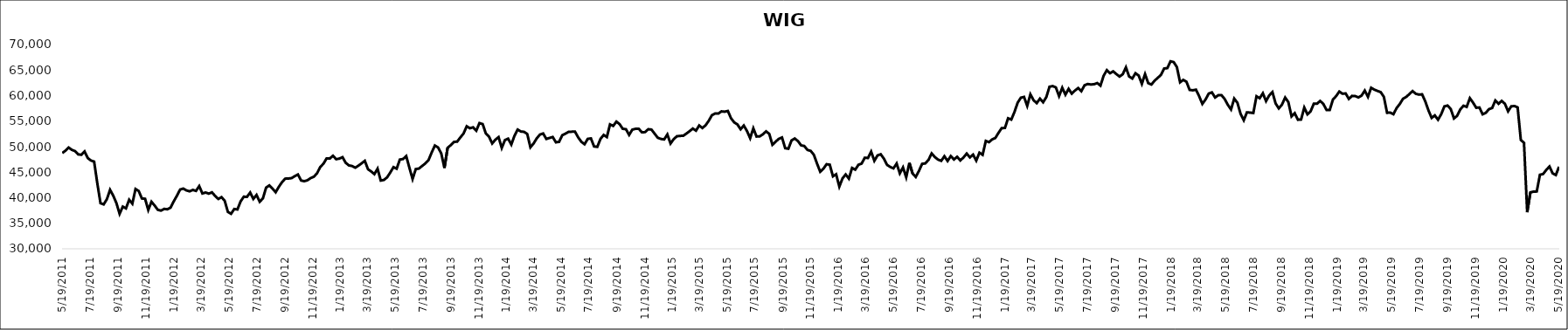
| Category | WIG |
|---|---|
| 5/19/11 | 48747.55 |
| 5/26/11 | 49215.53 |
| 6/2/11 | 49824.93 |
| 6/9/11 | 49378.82 |
| 6/16/11 | 49129.21 |
| 6/23/11 | 48485.26 |
| 6/30/11 | 48414.36 |
| 7/7/11 | 49057.05 |
| 7/14/11 | 47768.38 |
| 7/21/11 | 47291.31 |
| 7/28/11 | 47071.4 |
| 8/4/11 | 42828.22 |
| 8/11/11 | 38934.71 |
| 8/18/11 | 38697.56 |
| 8/25/11 | 39715.27 |
| 9/1/11 | 41553.09 |
| 9/8/11 | 40405.17 |
| 9/15/11 | 38945 |
| 9/22/11 | 36851.2 |
| 9/29/11 | 38264.32 |
| 10/6/11 | 37915.03 |
| 10/13/11 | 39608.13 |
| 10/20/11 | 38835.92 |
| 10/27/11 | 41708.88 |
| 11/3/11 | 41313.92 |
| 11/10/11 | 39853.18 |
| 11/17/11 | 39797.19 |
| 11/24/11 | 37607.27 |
| 12/1/11 | 39215.21 |
| 12/8/11 | 38474.28 |
| 12/15/11 | 37637.47 |
| 12/22/11 | 37478.7 |
| 12/29/11 | 37814.52 |
| 1/5/12 | 37739.39 |
| 1/12/12 | 38062.87 |
| 1/19/12 | 39288.13 |
| 1/26/12 | 40392.48 |
| 2/2/12 | 41602.24 |
| 2/9/12 | 41792.46 |
| 2/16/12 | 41430.3 |
| 2/23/12 | 41258.14 |
| 3/1/12 | 41533.87 |
| 3/8/12 | 41337.97 |
| 3/15/12 | 42281.33 |
| 3/22/12 | 40834.43 |
| 3/29/12 | 41028.06 |
| 4/5/12 | 40802.41 |
| 4/12/12 | 41053.82 |
| 4/19/12 | 40354.53 |
| 4/26/12 | 39761.78 |
| 5/3/12 | 40114.73 |
| 5/10/12 | 39404.16 |
| 5/17/12 | 37228.88 |
| 5/24/12 | 36852.75 |
| 5/31/12 | 37793.58 |
| 6/7/12 | 37707.25 |
| 6/14/12 | 39286.64 |
| 6/21/12 | 40207.61 |
| 6/28/12 | 40165.34 |
| 7/5/12 | 41013.96 |
| 7/12/12 | 39778.1 |
| 7/19/12 | 40545.64 |
| 7/26/12 | 39213.05 |
| 8/2/12 | 39876.95 |
| 8/9/12 | 41976.63 |
| 8/16/12 | 42408.41 |
| 8/23/12 | 41795.63 |
| 8/30/12 | 41077.44 |
| 9/6/12 | 42134.93 |
| 9/13/12 | 43047.41 |
| 9/20/12 | 43737.02 |
| 9/27/12 | 43763.3 |
| 10/4/12 | 43840.23 |
| 10/11/12 | 44224.67 |
| 10/18/12 | 44550.12 |
| 10/25/12 | 43374.6 |
| 11/1/12 | 43232.44 |
| 11/8/12 | 43429.42 |
| 11/15/12 | 43845.94 |
| 11/22/12 | 44121.53 |
| 11/29/12 | 44787.84 |
| 12/6/12 | 46019.97 |
| 12/13/12 | 46653.84 |
| 12/20/12 | 47701.82 |
| 12/27/12 | 47673.03 |
| 1/3/13 | 48222.72 |
| 1/10/13 | 47546.91 |
| 1/17/13 | 47661.37 |
| 1/24/13 | 47942.04 |
| 1/31/13 | 46840.15 |
| 2/7/13 | 46329.66 |
| 2/14/13 | 46211.54 |
| 2/21/13 | 45879.9 |
| 2/28/13 | 46280.36 |
| 3/7/13 | 46745.26 |
| 3/14/13 | 47223.68 |
| 3/21/13 | 45580.47 |
| 3/28/13 | 45147.57 |
| 4/4/13 | 44623.89 |
| 4/11/13 | 45688.48 |
| 4/18/13 | 43364.7 |
| 4/25/13 | 43482.18 |
| 5/2/13 | 43991.51 |
| 5/9/13 | 44943.16 |
| 5/16/13 | 45992.03 |
| 5/23/13 | 45687.76 |
| 5/30/13 | 47476.64 |
| 6/6/13 | 47573.66 |
| 6/13/13 | 48152.82 |
| 6/20/13 | 45870 |
| 6/27/13 | 43667.37 |
| 7/4/13 | 45613.75 |
| 7/11/13 | 45712.72 |
| 7/18/13 | 46221.23 |
| 7/25/13 | 46713.02 |
| 8/1/13 | 47370.81 |
| 8/8/13 | 48862.88 |
| 8/15/13 | 50223.95 |
| 8/22/13 | 49846.48 |
| 8/29/13 | 48676.45 |
| 9/5/13 | 45830.66 |
| 9/12/13 | 49771.55 |
| 9/19/13 | 50300.53 |
| 9/26/13 | 50936.34 |
| 10/3/13 | 50982.03 |
| 10/10/13 | 51806.83 |
| 10/17/13 | 52573.59 |
| 10/24/13 | 53994.46 |
| 10/31/13 | 53607.86 |
| 11/7/13 | 53785.07 |
| 11/14/13 | 53127.16 |
| 11/21/13 | 54621.21 |
| 11/28/13 | 54420.19 |
| 12/5/13 | 52597.13 |
| 12/12/13 | 51947.96 |
| 12/19/13 | 50631.75 |
| 12/26/13 | 51362.3 |
| 1/2/14 | 51865.89 |
| 1/9/14 | 49753.03 |
| 1/16/14 | 51288.7 |
| 1/23/14 | 51569.21 |
| 1/30/14 | 50417.17 |
| 2/6/14 | 52138.87 |
| 2/13/14 | 53349.65 |
| 2/20/14 | 52967.02 |
| 2/27/14 | 52906.04 |
| 3/6/14 | 52487.84 |
| 3/13/14 | 49878.65 |
| 3/20/14 | 50627.71 |
| 3/27/14 | 51642.99 |
| 4/3/14 | 52376.18 |
| 4/10/14 | 52580.73 |
| 4/17/14 | 51510.98 |
| 4/24/14 | 51705.76 |
| 5/1/14 | 51892.77 |
| 5/8/14 | 50851.25 |
| 5/15/14 | 50944.5 |
| 5/22/14 | 52244.13 |
| 5/29/14 | 52553.48 |
| 6/5/14 | 52901.29 |
| 6/12/14 | 52927.91 |
| 6/19/14 | 52937.45 |
| 6/26/14 | 51815.43 |
| 7/3/14 | 50951.73 |
| 7/10/14 | 50474.36 |
| 7/17/14 | 51527.37 |
| 7/24/14 | 51613.47 |
| 7/31/14 | 50037.12 |
| 8/7/14 | 49958.67 |
| 8/14/14 | 51512.57 |
| 8/21/14 | 52294.93 |
| 8/28/14 | 51882.01 |
| 9/4/14 | 54358.49 |
| 9/11/14 | 54065.27 |
| 9/18/14 | 54906.1 |
| 9/25/14 | 54411.77 |
| 10/2/14 | 53498.77 |
| 10/9/14 | 53416.03 |
| 10/16/14 | 52297.79 |
| 10/23/14 | 53335.43 |
| 10/30/14 | 53492 |
| 11/6/14 | 53512.14 |
| 11/13/14 | 52816.35 |
| 11/20/14 | 52848.54 |
| 11/27/14 | 53415.63 |
| 12/4/14 | 53346.86 |
| 12/11/14 | 52550.03 |
| 12/18/14 | 51739.04 |
| 12/25/14 | 51511.68 |
| 1/1/15 | 51416.08 |
| 1/8/15 | 52391 |
| 1/15/15 | 50616.63 |
| 1/22/15 | 51484.81 |
| 1/29/15 | 52040.24 |
| 2/5/15 | 52107.26 |
| 2/12/15 | 52139.81 |
| 2/19/15 | 52572.95 |
| 2/26/15 | 53042.6 |
| 3/5/15 | 53546.4 |
| 3/12/15 | 53136.13 |
| 3/19/15 | 54148.48 |
| 3/26/15 | 53649.9 |
| 4/2/15 | 54179.04 |
| 4/9/15 | 55063.85 |
| 4/16/15 | 56165.1 |
| 4/23/15 | 56492.95 |
| 4/30/15 | 56477.69 |
| 5/7/15 | 56911.34 |
| 5/14/15 | 56845.83 |
| 5/21/15 | 56990.6 |
| 5/28/15 | 55556.13 |
| 6/4/15 | 54749.74 |
| 6/11/15 | 54357.69 |
| 6/18/15 | 53408.53 |
| 6/25/15 | 54141.2 |
| 7/2/15 | 53074.71 |
| 7/9/15 | 51658.71 |
| 7/16/15 | 53588.24 |
| 7/23/15 | 51986.22 |
| 7/30/15 | 52011.81 |
| 8/6/15 | 52418.07 |
| 8/13/15 | 52995.96 |
| 8/20/15 | 52508.32 |
| 8/27/15 | 50366.09 |
| 9/3/15 | 50977.06 |
| 9/10/15 | 51527.08 |
| 9/17/15 | 51801.58 |
| 9/24/15 | 49701.31 |
| 10/1/15 | 49593.95 |
| 10/8/15 | 51222.77 |
| 10/15/15 | 51599.62 |
| 10/22/15 | 51094.29 |
| 10/29/15 | 50262.68 |
| 11/5/15 | 50125.85 |
| 11/12/15 | 49358.2 |
| 11/19/15 | 49177.74 |
| 11/26/15 | 48418.14 |
| 12/3/15 | 46693.09 |
| 12/10/15 | 45093.65 |
| 12/17/15 | 45684.05 |
| 12/24/15 | 46564.08 |
| 12/31/15 | 46467.38 |
| 1/7/16 | 44195.91 |
| 1/14/16 | 44596.08 |
| 1/21/16 | 42180.3 |
| 1/28/16 | 43778.96 |
| 2/4/16 | 44557.64 |
| 2/11/16 | 43741.96 |
| 2/18/16 | 45834.88 |
| 2/25/16 | 45497.77 |
| 3/3/16 | 46448.27 |
| 3/10/16 | 46686.74 |
| 3/17/16 | 47833.39 |
| 3/24/16 | 47778.01 |
| 3/31/16 | 49017.35 |
| 4/7/16 | 47231.36 |
| 4/14/16 | 48285.21 |
| 4/21/16 | 48514.39 |
| 4/28/16 | 47643.7 |
| 5/5/16 | 46430.16 |
| 5/12/16 | 46022.02 |
| 5/19/16 | 45751.68 |
| 5/26/16 | 46695.37 |
| 6/2/16 | 44772.72 |
| 6/9/16 | 45940.12 |
| 6/16/16 | 44007.81 |
| 6/23/16 | 46826.85 |
| 6/30/16 | 44748.53 |
| 7/7/16 | 44077.16 |
| 7/14/16 | 45246.26 |
| 7/21/16 | 46639.17 |
| 7/28/16 | 46718.98 |
| 8/4/16 | 47407.09 |
| 8/11/16 | 48675.96 |
| 8/18/16 | 47967.07 |
| 8/25/16 | 47464.07 |
| 9/1/16 | 47221.32 |
| 9/8/16 | 48129.15 |
| 9/15/16 | 47198.39 |
| 9/22/16 | 48154.88 |
| 9/29/16 | 47494.62 |
| 10/6/16 | 48014.44 |
| 10/13/16 | 47303.15 |
| 10/20/16 | 47894.17 |
| 10/27/16 | 48651.28 |
| 11/3/16 | 47899.61 |
| 11/10/16 | 48447.59 |
| 11/17/16 | 47274.21 |
| 11/24/16 | 48824.83 |
| 12/1/16 | 48404.21 |
| 12/8/16 | 51123.43 |
| 12/15/16 | 50881.35 |
| 12/22/16 | 51423.71 |
| 12/29/16 | 51703.91 |
| 1/5/17 | 52721.67 |
| 1/12/17 | 53650.94 |
| 1/19/17 | 53654.99 |
| 1/26/17 | 55560.23 |
| 2/2/17 | 55303.11 |
| 2/9/17 | 56785.52 |
| 2/16/17 | 58610.28 |
| 2/23/17 | 59583.89 |
| 3/2/17 | 59743.64 |
| 3/9/17 | 57986.6 |
| 3/16/17 | 60247.18 |
| 3/23/17 | 59093.68 |
| 3/30/17 | 58527.2 |
| 4/6/17 | 59406.36 |
| 4/13/17 | 58695.36 |
| 4/20/17 | 59700.07 |
| 4/27/17 | 61731.8 |
| 5/4/17 | 61862.8 |
| 5/11/17 | 61598.78 |
| 5/18/17 | 59901.12 |
| 5/25/17 | 61536.22 |
| 6/1/17 | 60181.96 |
| 6/8/17 | 61312.68 |
| 6/15/17 | 60381.07 |
| 6/22/17 | 60987.33 |
| 6/29/17 | 61475.96 |
| 7/6/17 | 60869.83 |
| 7/13/17 | 62018.68 |
| 7/20/17 | 62269.72 |
| 7/27/17 | 62171.7 |
| 8/3/17 | 62231.08 |
| 8/10/17 | 62451.57 |
| 8/17/17 | 61949.4 |
| 8/24/17 | 63886.54 |
| 8/31/17 | 64973.76 |
| 9/7/17 | 64381.87 |
| 9/14/17 | 64748.47 |
| 9/21/17 | 64209.19 |
| 9/28/17 | 63729.77 |
| 10/5/17 | 64185.71 |
| 10/12/17 | 65529.1 |
| 10/19/17 | 63745 |
| 10/26/17 | 63342.71 |
| 11/2/17 | 64375.83 |
| 11/9/17 | 63923.62 |
| 11/16/17 | 62299.29 |
| 11/23/17 | 64207.77 |
| 11/30/17 | 62440.31 |
| 12/7/17 | 62164.65 |
| 12/14/17 | 62916.39 |
| 12/21/17 | 63477.25 |
| 12/28/17 | 64053.47 |
| 1/4/18 | 65297.96 |
| 1/11/18 | 65379.88 |
| 1/18/18 | 66709.12 |
| 1/25/18 | 66561.79 |
| 2/1/18 | 65585.79 |
| 2/8/18 | 62604.89 |
| 2/15/18 | 63078.16 |
| 2/22/18 | 62717.27 |
| 3/1/18 | 61116.96 |
| 3/8/18 | 61036.99 |
| 3/15/18 | 61156.91 |
| 3/22/18 | 59862.55 |
| 3/29/18 | 58377.42 |
| 4/5/18 | 59244.04 |
| 4/12/18 | 60393.23 |
| 4/19/18 | 60629.81 |
| 4/26/18 | 59628.04 |
| 5/3/18 | 60066.46 |
| 5/10/18 | 60091.26 |
| 5/17/18 | 59337.27 |
| 5/24/18 | 58189.49 |
| 5/31/18 | 57282.73 |
| 6/7/18 | 59412.76 |
| 6/14/18 | 58603.93 |
| 6/21/18 | 56425.25 |
| 6/28/18 | 55169.77 |
| 7/5/18 | 56719.88 |
| 7/12/18 | 56671.44 |
| 7/19/18 | 56585.5 |
| 7/26/18 | 59871.2 |
| 8/2/18 | 59484.35 |
| 8/9/18 | 60455.75 |
| 8/16/18 | 58921.44 |
| 8/23/18 | 60044.45 |
| 8/30/18 | 60690.32 |
| 9/6/18 | 58469.6 |
| 9/13/18 | 57493.38 |
| 9/20/18 | 58231.57 |
| 9/27/18 | 59616.27 |
| 10/4/18 | 58736.08 |
| 10/11/18 | 55941.06 |
| 10/18/18 | 56560.93 |
| 10/25/18 | 55271.63 |
| 11/1/18 | 55312.71 |
| 11/8/18 | 57655.73 |
| 11/15/18 | 56329.01 |
| 11/22/18 | 56932.62 |
| 11/29/18 | 58412.94 |
| 12/6/18 | 58409.09 |
| 12/13/18 | 58952.55 |
| 12/20/18 | 58349.03 |
| 12/27/18 | 57183.28 |
| 1/3/19 | 57192.42 |
| 1/10/19 | 59219.23 |
| 1/17/19 | 59894.9 |
| 1/24/19 | 60791.02 |
| 1/31/19 | 60367.42 |
| 2/7/19 | 60422.38 |
| 2/14/19 | 59348.4 |
| 2/21/19 | 59938.07 |
| 2/28/19 | 59903.7 |
| 3/7/19 | 59638.3 |
| 3/14/19 | 60002.72 |
| 3/21/19 | 60976.51 |
| 3/28/19 | 59752.66 |
| 4/4/19 | 61533.27 |
| 4/11/19 | 61168.92 |
| 4/18/19 | 60910.11 |
| 4/25/19 | 60680.62 |
| 5/2/19 | 59744.3 |
| 5/9/19 | 56637.25 |
| 5/16/19 | 56664.5 |
| 5/23/19 | 56351.13 |
| 5/30/19 | 57566.83 |
| 6/6/19 | 58360.5 |
| 6/13/19 | 59374.38 |
| 6/20/19 | 59738.56 |
| 6/27/19 | 60293.37 |
| 7/4/19 | 60888.98 |
| 7/11/19 | 60362.11 |
| 7/18/19 | 60192.6 |
| 7/25/19 | 60249.72 |
| 8/1/19 | 58863.73 |
| 8/8/19 | 57102.69 |
| 8/15/19 | 55634.7 |
| 8/22/19 | 56118.92 |
| 8/29/19 | 55273.05 |
| 9/5/19 | 56358.3 |
| 9/12/19 | 57886.6 |
| 9/19/19 | 58053.03 |
| 9/26/19 | 57377.87 |
| 10/3/19 | 55523.06 |
| 10/10/19 | 56034.97 |
| 10/17/19 | 57297.12 |
| 10/24/19 | 58012.97 |
| 10/31/19 | 57783.02 |
| 11/7/19 | 59492.22 |
| 11/14/19 | 58622.1 |
| 11/21/19 | 57618.54 |
| 11/28/19 | 57669.94 |
| 12/5/19 | 56338.75 |
| 12/12/19 | 56621.06 |
| 12/19/19 | 57346.95 |
| 12/26/19 | 57569.71 |
| 1/2/20 | 59048.28 |
| 1/9/20 | 58397.17 |
| 1/16/20 | 58962.37 |
| 1/23/20 | 58401.85 |
| 1/30/20 | 56923.36 |
| 2/6/20 | 57900.04 |
| 2/13/20 | 57960.23 |
| 2/20/20 | 57693.12 |
| 2/27/20 | 51318.69 |
| 3/5/20 | 50753.91 |
| 3/12/20 | 37164.02 |
| 3/19/20 | 41041.92 |
| 3/26/20 | 41202.98 |
| 4/2/20 | 41219.51 |
| 4/9/20 | 44499.23 |
| 4/16/20 | 44645.12 |
| 4/23/20 | 45450.43 |
| 4/30/20 | 46117 |
| 5/7/20 | 44769.05 |
| 5/14/20 | 44450.71 |
| 5/21/20 | 46073.39 |